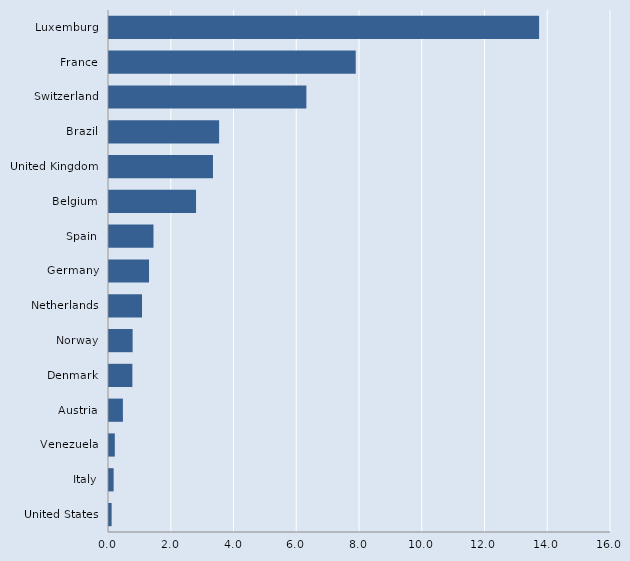
| Category | Series 0 |
|---|---|
| United States | 0.083 |
| Italy | 0.147 |
| Venezuela | 0.185 |
| Austria | 0.444 |
| Denmark | 0.745 |
| Norway | 0.753 |
| Netherlands | 1.052 |
| Germany | 1.276 |
| Spain | 1.418 |
| Belgium | 2.775 |
| United Kingdom | 3.314 |
| Brazil | 3.51 |
| Switzerland | 6.291 |
| France | 7.864 |
| Luxemburg | 13.709 |